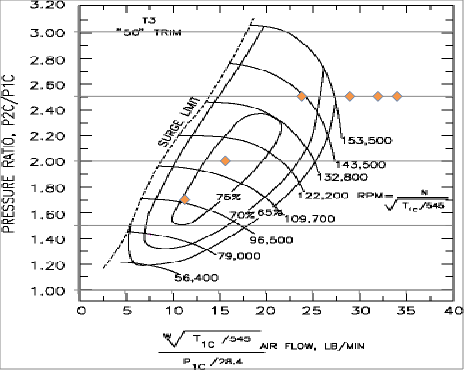
| Category | Series 0 |
|---|---|
| 11.390200287153347 | 1.7 |
| 15.71934798621418 | 2 |
| 23.8689817661372 | 2.5 |
| 28.99639266404816 | 2.5 |
| 31.99327593024094 | 2.5 |
| 34.03539992578823 | 2.5 |